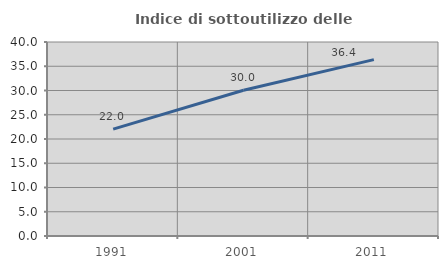
| Category | Indice di sottoutilizzo delle abitazioni  |
|---|---|
| 1991.0 | 22.042 |
| 2001.0 | 30.04 |
| 2011.0 | 36.372 |